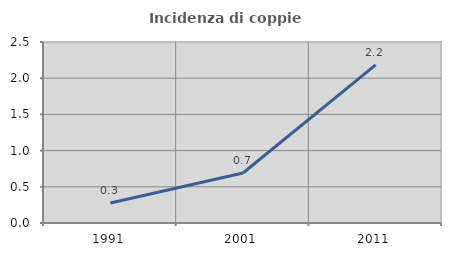
| Category | Incidenza di coppie miste |
|---|---|
| 1991.0 | 0.277 |
| 2001.0 | 0.691 |
| 2011.0 | 2.183 |